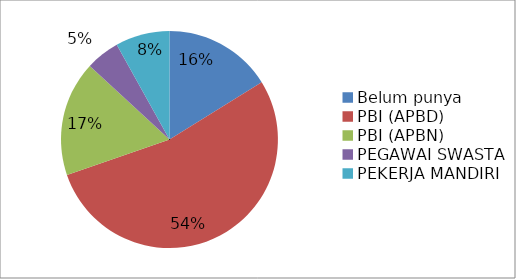
| Category | Series 1 |
|---|---|
| Belum punya | 16.162 |
| PBI (APBD) | 53.535 |
| PBI (APBN) | 17.172 |
| PEGAWAI SWASTA | 5.051 |
| PEKERJA MANDIRI | 8.081 |